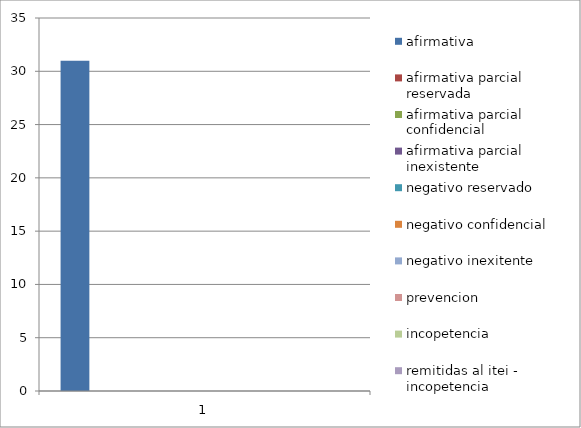
| Category | afirmativa | afirmativa parcial reservada | afirmativa parcial confidencial | afirmativa parcial inexistente | negativo reservado | negativo confidencial | negativo inexitente | prevencion | incopetencia | remitidas al itei - incopetencia |
|---|---|---|---|---|---|---|---|---|---|---|
| 0 | 31 | 0 | 0 | 0 | 0 | 0 | 0 | 0 | 0 | 0 |